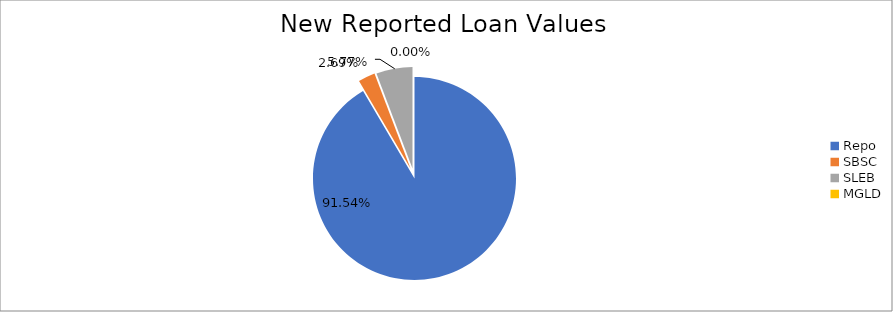
| Category | Series 0 |
|---|---|
| Repo | 6842564.935 |
| SBSC | 201050.918 |
| SLEB | 431687.099 |
| MGLD | 11.766 |